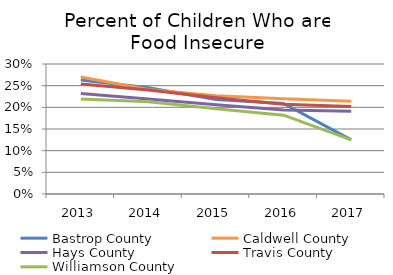
| Category | Bastrop County | Caldwell County | Hays County | Travis County | Williamson County |
|---|---|---|---|---|---|
| 2013.0 | 0.263 | 0.27 | 0.232 | 0.254 | 0.219 |
| 2014.0 | 0.245 | 0.241 | 0.219 | 0.24 | 0.213 |
| 2015.0 | 0.218 | 0.227 | 0.206 | 0.222 | 0.197 |
| 2016.0 | 0.209 | 0.22 | 0.194 | 0.207 | 0.182 |
| 2017.0 | 0.125 | 0.214 | 0.191 | 0.202 | 0.125 |